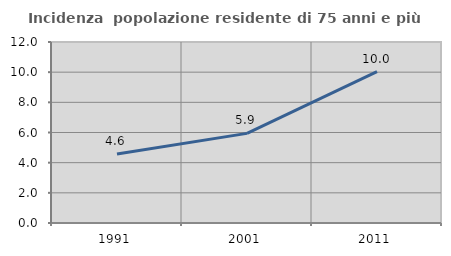
| Category | Incidenza  popolazione residente di 75 anni e più |
|---|---|
| 1991.0 | 4.572 |
| 2001.0 | 5.943 |
| 2011.0 | 10.04 |